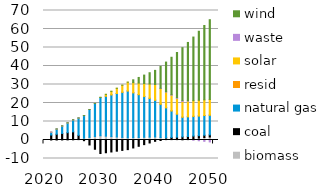
| Category | biomass | coal | natural gas | resid | solar | waste | wind |
|---|---|---|---|---|---|---|---|
| 2020.0 | 0 | 0 | 0 | 0 | 0 | 0 | 0 |
| 2021.0 | 0 | 2.667 | 1.57 | 0 | 0 | 0.056 | 0 |
| 2022.0 | 0.037 | 3.064 | 2.803 | 0 | 0 | 0.048 | 0 |
| 2023.0 | 0.075 | 3.462 | 4.036 | 0 | 0 | 0.041 | 0 |
| 2024.0 | 0.112 | 3.859 | 5.269 | 0 | 0 | 0.033 | 0 |
| 2025.0 | 0.15 | 4.256 | 6.502 | 0 | 0 | 0.026 | 0 |
| 2026.0 | 0.578 | 1.942 | 9.351 | 0 | 0 | 0.021 | 0 |
| 2027.0 | 1.006 | -0.372 | 12.199 | 0 | 0 | 0.015 | 0 |
| 2028.0 | 1.434 | -2.687 | 15.048 | 0 | 0 | 0.01 | 0 |
| 2029.0 | 1.862 | -5.001 | 17.896 | 0 | 0 | 0.005 | 0 |
| 2030.0 | 2.291 | -7.315 | 20.744 | 0 | 0 | 0 | 0 |
| 2031.0 | 2.068 | -6.892 | 21.666 | 0.001 | 0.945 | 0 | 0 |
| 2032.0 | 1.845 | -6.469 | 22.588 | 0.001 | 1.89 | 0 | 0 |
| 2033.0 | 1.622 | -6.046 | 23.51 | 0.002 | 2.835 | 0 | 0.001 |
| 2034.0 | 1.399 | -5.623 | 24.431 | 0.003 | 3.779 | 0 | 0.001 |
| 2035.0 | 1.177 | -5.2 | 25.353 | 0.004 | 4.724 | 0 | 0.001 |
| 2036.0 | 1.27 | -4.302 | 24.263 | 0.004 | 5.469 | 0 | 1.527 |
| 2037.0 | 1.364 | -3.404 | 23.174 | 0.004 | 6.215 | 0 | 3.053 |
| 2038.0 | 1.458 | -2.506 | 22.084 | 0.004 | 6.96 | 0 | 4.579 |
| 2039.0 | 1.552 | -1.608 | 20.994 | 0.004 | 7.705 | 0 | 6.105 |
| 2040.0 | 1.646 | -0.71 | 19.904 | 0.004 | 8.45 | 0 | 7.632 |
| 2041.0 | 1.347 | -0.26 | 18.058 | 0.004 | 8.45 | 0.104 | 11.821 |
| 2042.0 | 1.047 | 0.19 | 16.211 | 0.004 | 8.45 | 0.207 | 16.009 |
| 2043.0 | 0.748 | 0.641 | 14.364 | 0.004 | 8.45 | 0.311 | 20.198 |
| 2044.0 | 0.449 | 1.091 | 12.517 | 0.004 | 8.45 | 0.415 | 24.387 |
| 2045.0 | 0.15 | 1.541 | 10.671 | 0.004 | 8.45 | 0.519 | 28.576 |
| 2046.0 | 0.446 | 1.465 | 10.671 | 0.004 | 8.45 | 0.208 | 31.484 |
| 2047.0 | 0.742 | 1.388 | 10.671 | 0.004 | 8.45 | -0.103 | 34.392 |
| 2048.0 | 1.038 | 1.312 | 10.671 | 0.004 | 8.45 | -0.414 | 37.3 |
| 2049.0 | 1.334 | 1.236 | 10.671 | 0.004 | 8.45 | -0.725 | 40.208 |
| 2050.0 | 1.63 | 1.16 | 10.671 | 0.004 | 8.45 | -1.036 | 43.116 |